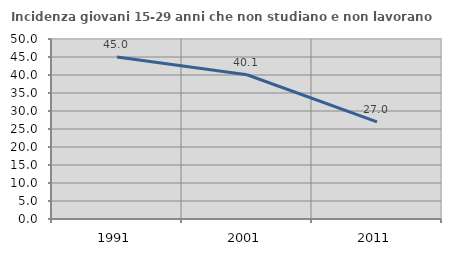
| Category | Incidenza giovani 15-29 anni che non studiano e non lavorano  |
|---|---|
| 1991.0 | 44.988 |
| 2001.0 | 40.068 |
| 2011.0 | 26.957 |